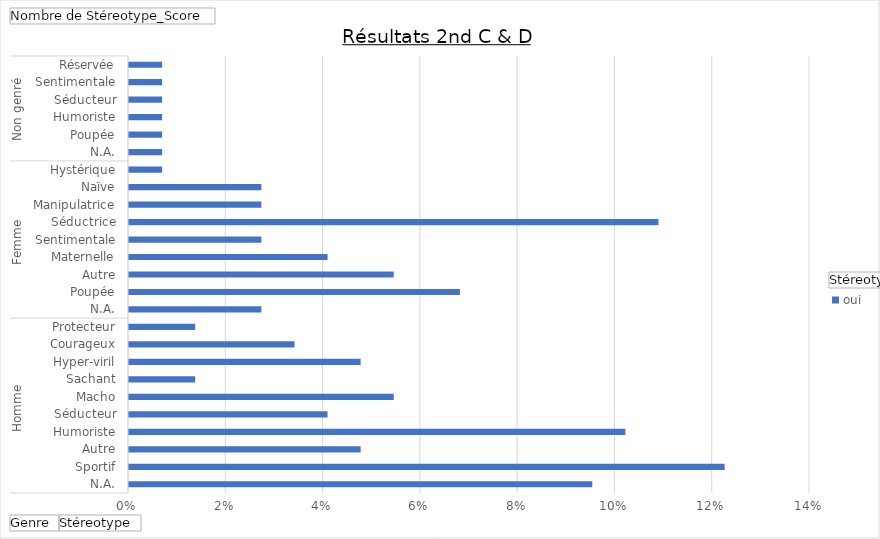
| Category | oui |
|---|---|
| 0 | 0.095 |
| 1 | 0.122 |
| 2 | 0.048 |
| 3 | 0.102 |
| 4 | 0.041 |
| 5 | 0.054 |
| 6 | 0.014 |
| 7 | 0.048 |
| 8 | 0.034 |
| 9 | 0.014 |
| 10 | 0.027 |
| 11 | 0.068 |
| 12 | 0.054 |
| 13 | 0.041 |
| 14 | 0.027 |
| 15 | 0.109 |
| 16 | 0.027 |
| 17 | 0.027 |
| 18 | 0.007 |
| 19 | 0.007 |
| 20 | 0.007 |
| 21 | 0.007 |
| 22 | 0.007 |
| 23 | 0.007 |
| 24 | 0.007 |